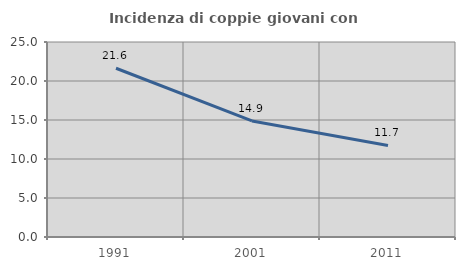
| Category | Incidenza di coppie giovani con figli |
|---|---|
| 1991.0 | 21.636 |
| 2001.0 | 14.883 |
| 2011.0 | 11.737 |